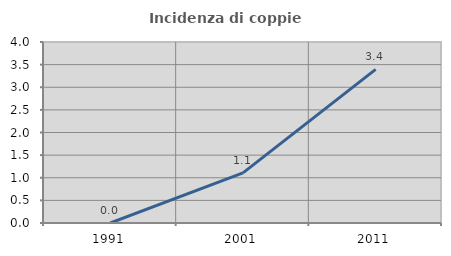
| Category | Incidenza di coppie miste |
|---|---|
| 1991.0 | 0 |
| 2001.0 | 1.107 |
| 2011.0 | 3.394 |